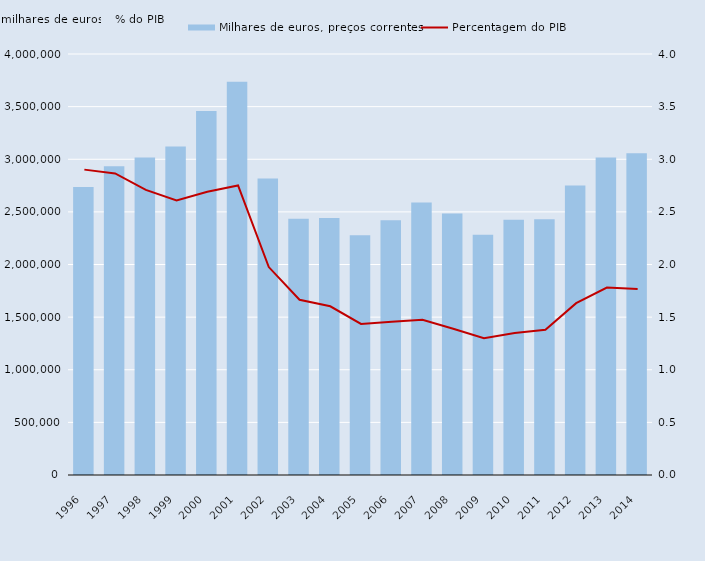
| Category | Milhares de euros, preços correntes |
|---|---|
| 1996.0 | 2737490 |
| 1997.0 | 2932550 |
| 1998.0 | 3016290 |
| 1999.0 | 3121680 |
| 2000.0 | 3458120 |
| 2001.0 | 3736820 |
| 2002.0 | 2817880 |
| 2003.0 | 2433780 |
| 2004.0 | 2442160 |
| 2005.0 | 2277250 |
| 2006.0 | 2420270 |
| 2007.0 | 2588420 |
| 2008.0 | 2484680 |
| 2009.0 | 2281870 |
| 2010.0 | 2425900 |
| 2011.0 | 2430490 |
| 2012.0 | 2749460 |
| 2013.0 | 3015780 |
| 2014.0 | 3057270 |